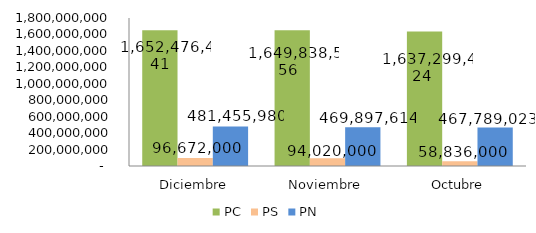
| Category | PC | PS | PN |
|---|---|---|---|
| Diciembre | 1652476440.68 | 96672000 | 481455980.32 |
| Noviembre | 1649838556.38 | 94020000 | 469897614.09 |
| Octubre | 1637299424.13 | 58836000 | 467789023.39 |